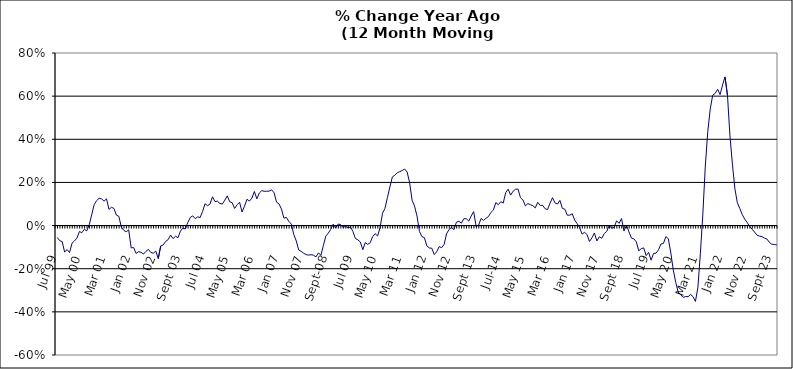
| Category | Series 0 |
|---|---|
| Jul 99 | -0.055 |
| Aug 99 | -0.07 |
| Sep 99 | -0.074 |
| Oct 99 | -0.123 |
| Nov 99 | -0.111 |
| Dec 99 | -0.125 |
| Jan 00 | -0.082 |
| Feb 00 | -0.071 |
| Mar 00 | -0.058 |
| Apr 00 | -0.027 |
| May 00 | -0.033 |
| Jun 00 | -0.017 |
| Jul 00 | -0.025 |
| Aug 00 | 0.005 |
| Sep 00 | 0.05 |
| Oct 00 | 0.098 |
| Nov 00 | 0.116 |
| Dec 00 | 0.127 |
| Jan 01 | 0.124 |
| Feb 01 | 0.113 |
| Mar 01 | 0.124 |
| Apr 01 | 0.075 |
| May 01 | 0.085 |
| Jun 01 | 0.08 |
| Jul 01 | 0.048 |
| Aug 01 | 0.043 |
| Sep 01 | -0.007 |
| Oct 01 | -0.022 |
| Nov 01 | -0.029 |
| Dec 01 | -0.02 |
| Jan 02 | -0.103 |
| Feb 02 | -0.102 |
| Mar 02 | -0.129 |
| Apr 02 | -0.121 |
| May 02 | -0.124 |
| Jun 02 | -0.132 |
| Jul 02 | -0.119 |
| Aug 02 | -0.11 |
| Sep 02 | -0.125 |
| Oct 02 | -0.128 |
| Nov 02 | -0.118 |
| Dec 02 | -0.153 |
| Jan 03 | -0.094 |
| Feb 03 | -0.09 |
| Mar 03 | -0.073 |
| Apr 03 | -0.065 |
| May 03 | -0.044 |
| Jun 03 | -0.06 |
| Jul 03 | -0.049 |
| Aug 03 | -0.056 |
| Sep 03 | -0.026 |
| Oct 03 | -0.012 |
| Nov 03 | -0.016 |
| Dec 03 | 0.014 |
| Jan 04 | 0.038 |
| Feb 04 | 0.045 |
| Mar 04 | 0.032 |
| Apr 04 | 0.041 |
| May 04 | 0.037 |
| Jun 04 | 0.066 |
| Jul 04 | 0.101 |
| Aug 04 | 0.092 |
| Sep 04 | 0.1 |
| Oct 04 | 0.133 |
| Nov 04 | 0.111 |
| Dec 04 | 0.113 |
| Jan 05 | 0.103 |
| Feb 05 | 0.1 |
| Mar 05 | 0.118 |
| Apr 05 | 0.138 |
| May 05 | 0.11 |
| Jun 05 | 0.106 |
| Jul 05 | 0.079 |
| Aug 05 | 0.097 |
| Sep 05 | 0.108 |
| Oct 05 | 0.063 |
| Nov 05 | 0.09 |
| Dec 05 | 0.122 |
| Jan 06 | 0.114 |
| Feb 06 | 0.127 |
| Mar 06 | 0.158 |
| Apr 06 | 0.124 |
| May 06 | 0.151 |
| Jun 06 | 0.162 |
| Jul 06 | 0.159 |
| Aug 06 | 0.159 |
| Sep 06 | 0.16 |
| Oct 06 | 0.166 |
| Nov 06 | 0.152 |
| Dec 06 | 0.109 |
| Jan 07 | 0.101 |
| Feb 07 | 0.076 |
| Mar 07 | 0.034 |
| Apr 07 | 0.038 |
| May 07 | 0.019 |
| Jun 07 | 0.007 |
| Jul 07 | -0.041 |
| Aug 07 | -0.071 |
| Sep 07 | -0.113 |
| Oct 07 | -0.12 |
| Nov 07 | -0.128 |
| Dec 07 | -0.135 |
| Jan 08 | -0.137 |
| Feb 08 | -0.135 |
| Mar 08 | -0.137 |
| Apr 08 | -0.145 |
| May 08 | -0.126 |
| Jun 08 | -0.138 |
| Jul 08 | -0.093 |
| Aug 08 | -0.049 |
| Sep-08 | -0.035 |
| Oct 08 | -0.018 |
| Nov 08 | 0.007 |
| Dec 08 | -0.011 |
| Jan 09 | 0.007 |
| Feb 09 | 0.005 |
| Mar 09 | -0.009 |
| Apr 09 | -0.003 |
| May 09 | -0.01 |
| Jun 09 | -0.007 |
| Jul 09 | -0.027 |
| Aug 09 | -0.06 |
| Sep 09 | -0.066 |
| Oct 09 | -0.076 |
| Nov 09 | -0.112 |
| Dec 09 | -0.079 |
| Jan 10 | -0.087 |
| Feb 10 | -0.079 |
| Mar 10 | -0.052 |
| Apr 10 | -0.037 |
| May 10 | -0.048 |
| Jun 10 | -0.01 |
| Jul 10 | 0.057 |
| Aug 10 | 0.08 |
| Sep 10 | 0.13 |
| Oct 10 | 0.179 |
| Nov 10 | 0.226 |
| Dec 10 | 0.233 |
| Jan 11 | 0.245 |
| Feb 11 | 0.25 |
| Mar 11 | 0.255 |
| Apr 11 | 0.262 |
| May 11 | 0.248 |
| Jun 11 | 0.199 |
| Jul 11 | 0.118 |
| Aug 11 | 0.09 |
| Sep 11 | 0.044 |
| Oct 11 | -0.028 |
| Nov 11 | -0.051 |
| Dec 11 | -0.056 |
| Jan 12 | -0.094 |
| Feb 12 | -0.104 |
| Mar 12 | -0.105 |
| Apr 12 | -0.134 |
| May 12 | -0.121 |
| Jun 12 | -0.098 |
| Jul 12 | -0.103 |
| Aug 12 | -0.087 |
| Sep 12 | -0.038 |
| Oct 12 | -0.018 |
| Nov 12 | -0.009 |
| Dec 12 | -0.019 |
| Jan 13 | 0.016 |
| Feb-13 | 0.02 |
| Mar-13 | 0.011 |
| Apr 13 | 0.032 |
| May 13 | 0.032 |
| Jun-13 | 0.021 |
| Jul 13 | 0.045 |
| Aug 13 | 0.065 |
| Sep 13 | -0.005 |
| Oct 13 | 0.002 |
| Nov 13 | 0.033 |
| Dec 13 | 0.024 |
| Jan 14 | 0.034 |
| Feb-14 | 0.042 |
| Mar 14 | 0.061 |
| Apr 14 | 0.072 |
| May 14 | 0.107 |
| Jun 14 | 0.097 |
| Jul-14 | 0.111 |
| Aug-14 | 0.105 |
| Sep 14 | 0.153 |
| Oct 14 | 0.169 |
| Nov 14 | 0.141 |
| Dec 14 | 0.159 |
| Jan 15 | 0.169 |
| Feb 15 | 0.169 |
| Mar 15 | 0.129 |
| Apr-15 | 0.118 |
| May 15 | 0.091 |
| Jun-15 | 0.102 |
| Jul 15 | 0.097 |
| Aug 15 | 0.092 |
| Sep 15 | 0.082 |
| Oct 15 | 0.108 |
| Nov 15 | 0.093 |
| Dec 15 | 0.094 |
| Jan 16 | 0.078 |
| Feb 16 | 0.075 |
| Mar 16 | 0.104 |
| Apr 16 | 0.129 |
| May 16 | 0.105 |
| Jun 16 | 0.1 |
| Jul 16 | 0.117 |
| Aug 16 | 0.08 |
| Sep 16 | 0.076 |
| Oct 16 | 0.048 |
| Nov 16 | 0.048 |
| Dec 16 | 0.055 |
| Jan 17 | 0.025 |
| Feb 17 | 0.009 |
| Mar 17 | -0.01 |
| Apr 17 | -0.04 |
| May 17 | -0.031 |
| Jun 17 | -0.042 |
| Jul 17 | -0.074 |
| Aug 17 | -0.057 |
| Sep 17 | -0.035 |
| Oct 17 | -0.071 |
| Nov 17 | -0.052 |
| Dec 17 | -0.059 |
| Jan 18 | -0.037 |
| Feb 18 | -0.027 |
| Mar 18 | 0 |
| Apr 18 | -0.012 |
| May 18 | -0.009 |
| Jun 18 | 0.022 |
| Jul 18 | 0.01 |
| Aug 18 | 0.033 |
| Sep 18 | -0.025 |
| Oct 18 | 0.002 |
| Nov 18 | -0.029 |
| Dec 18 | -0.058 |
| Jan 19 | -0.061 |
| Feb 19 | -0.075 |
| Mar 19 | -0.117 |
| Apr 19 | -0.107 |
| May 19 | -0.104 |
| Jun 19 | -0.139 |
| Jul 19 | -0.124 |
| Aug 19 | -0.16 |
| Sep 19 | -0.129 |
| Oct 19 | -0.128 |
| Nov 19 | -0.112 |
| Dec 19 | -0.085 |
| Jan 20 | -0.083 |
| Feb 20 | -0.051 |
| Mar 20 | -0.061 |
| Apr 20 | -0.127 |
| May 20 | -0.206 |
| Jun 20 | -0.264 |
| Jul 20 | -0.308 |
| Aug 20 | -0.32 |
| Sep 20 | -0.333 |
| Oct 20 | -0.329 |
| Nov 20 | -0.33 |
| Dec 20 | -0.319 |
| Jan 21 | -0.329 |
| Feb 21 | -0.352 |
| Mar 21 | -0.286 |
| Apr 21 | -0.129 |
| May 21 | 0.053 |
| Jun 21 | 0.276 |
| Jul 21 | 0.435 |
| Aug 21 | 0.541 |
| Sep 21 | 0.604 |
| Oct 21 | 0.613 |
| Nov 21 | 0.632 |
| Dec 21 | 0.608 |
| Jan 22 | 0.652 |
| Feb 22 | 0.689 |
| Mar 22 | 0.603 |
| Apr 22 | 0.416 |
| May 22 | 0.285 |
| Jun 22 | 0.171 |
| Jul 22 | 0.106 |
| Aug 22 | 0.079 |
| Sep 22 | 0.051 |
| Oct 22 | 0.03 |
| Nov 22 | 0.014 |
| Dec 22 | -0.004 |
| Jan 23 | -0.017 |
| Feb 23 | -0.031 |
| Mar 23 | -0.045 |
| Apr 23 | -0.049 |
| May 23 | -0.051 |
| Jun 23 | -0.058 |
| Jul 23 | -0.062 |
| Aug 23 | -0.078 |
| Sep 23 | -0.087 |
| Oct 23 | -0.087 |
| Nov 23 | -0.09 |